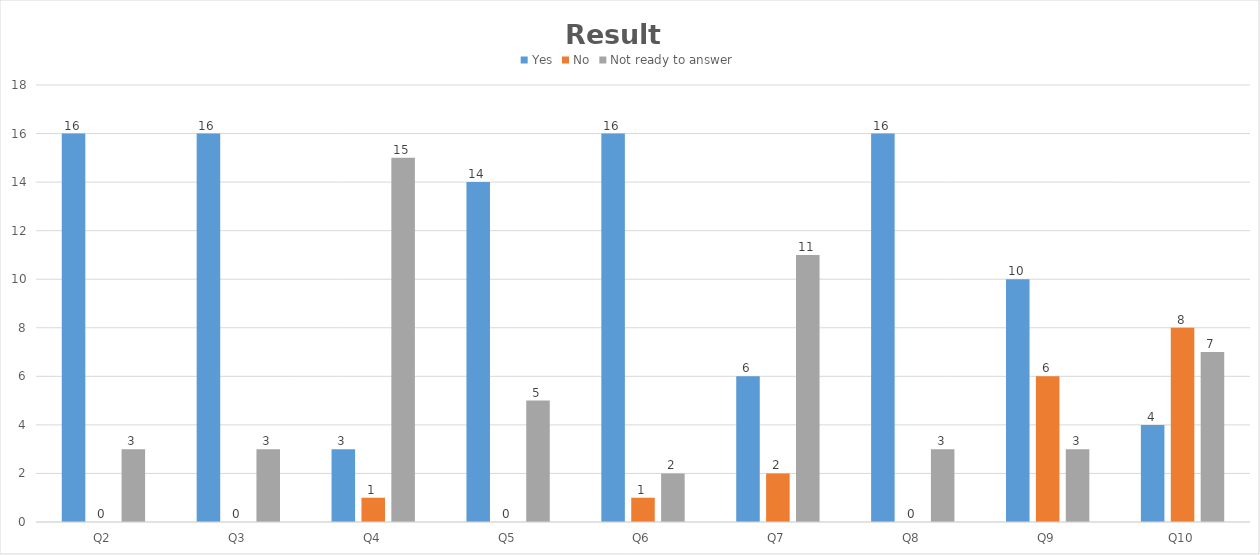
| Category | Yes | No | Not ready to answer |
|---|---|---|---|
| Q2 | 16 | 0 | 3 |
| Q3 | 16 | 0 | 3 |
| Q4 | 3 | 1 | 15 |
| Q5 | 14 | 0 | 5 |
| Q6 | 16 | 1 | 2 |
| Q7 | 6 | 2 | 11 |
| Q8 | 16 | 0 | 3 |
| Q9 | 10 | 6 | 3 |
| Q10 | 4 | 8 | 7 |